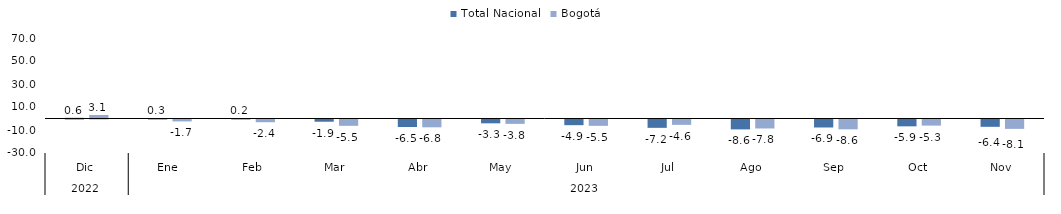
| Category | Total Nacional | Bogotá |
|---|---|---|
| 0 | 0.609 | 3.067 |
| 1 | 0.259 | -1.667 |
| 2 | 0.21 | -2.385 |
| 3 | -1.94 | -5.499 |
| 4 | -6.51 | -6.782 |
| 5 | -3.322 | -3.813 |
| 6 | -4.933 | -5.504 |
| 7 | -7.248 | -4.641 |
| 8 | -8.59 | -7.799 |
| 9 | -6.944 | -8.551 |
| 10 | -5.945 | -5.309 |
| 11 | -6.365 | -8.138 |